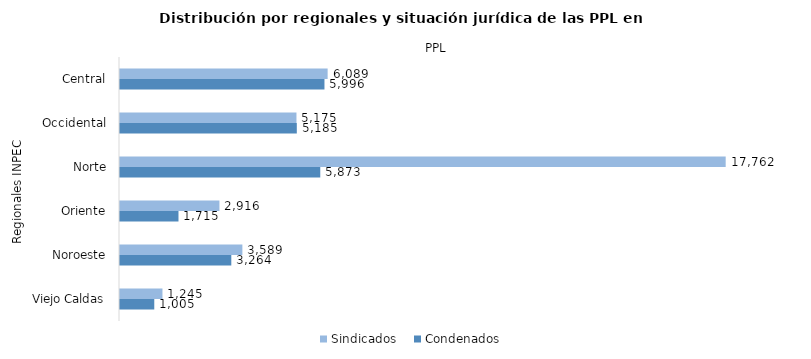
| Category | Sindicados | Condenados |
|---|---|---|
| Central | 6089 | 5996 |
| Occidental | 5175 | 5185 |
| Norte | 17762 | 5873 |
| Oriente | 2916 | 1715 |
| Noroeste | 3589 | 3264 |
| Viejo Caldas | 1245 | 1005 |